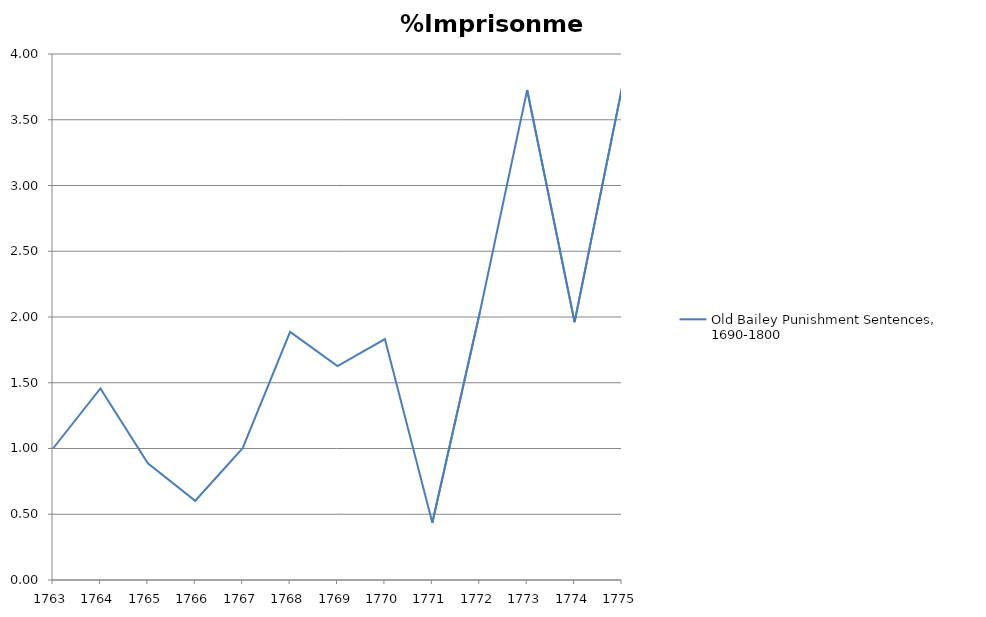
| Category | Old Bailey Punishment Sentences, 1690-1800 |
|---|---|
| 1763 | 1 |
| 1764 | 1.456 |
| 1765 | 0.888 |
| 1766 | 0.602 |
| 1767 | 1.003 |
| 1768 | 1.887 |
| 1769 | 1.626 |
| 1770 | 1.832 |
| 1771 | 0.435 |
| 1772 | 2.032 |
| 1773 | 3.727 |
| 1774 | 1.961 |
| 1775 | 3.743 |